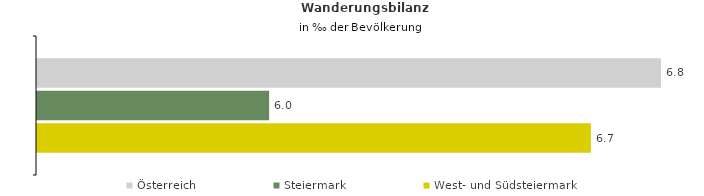
| Category | Österreich | Steiermark | West- und Südsteiermark |
|---|---|---|---|
| Wanderungsrate in ‰ der Bevölkerung, Periode 2018-2022 | 6.822 | 5.992 | 6.673 |